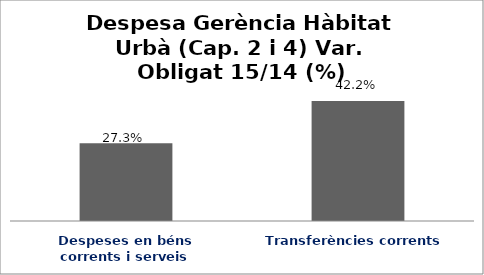
| Category | Series 0 |
|---|---|
| Despeses en béns corrents i serveis | 0.273 |
| Transferències corrents | 0.422 |